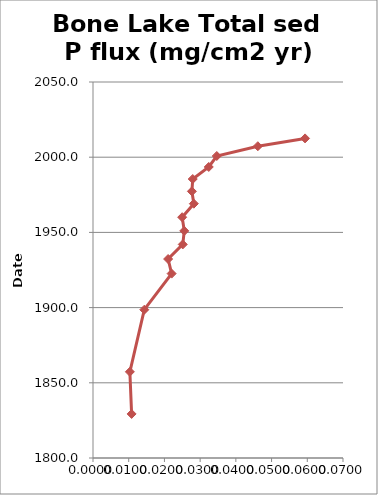
| Category | Total sed P flux (mg/cm2 yr) |
|---|---|
| 0.05938018248609675 | 2012.5 |
| 0.046148538297122205 | 2007.3 |
| 0.03465334723475389 | 2000.8 |
| 0.03241109181406098 | 1993.5 |
| 0.027928209518284574 | 1985.5 |
| 0.027693471295549724 | 1977.3 |
| 0.028233143358840574 | 1969.1 |
| 0.02496680738231769 | 1960.1 |
| 0.025555347555081737 | 1951 |
| 0.02513741269439226 | 1942 |
| 0.02103469129226802 | 1932.3 |
| 0.022018136181018104 | 1922.6 |
| 0.014366272914805115 | 1898.6 |
| 0.010321681477087227 | 1857.3 |
| 0.010811791671420169 | 1829.3 |